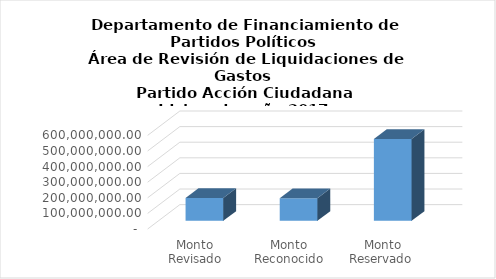
| Category | Series 0 |
|---|---|
| Monto Revisado (DFPP) | 147113725.49 |
| Monto Reconocido (TSE) | 145417918.58 |
| Monto Reservado  | 524929954.49 |